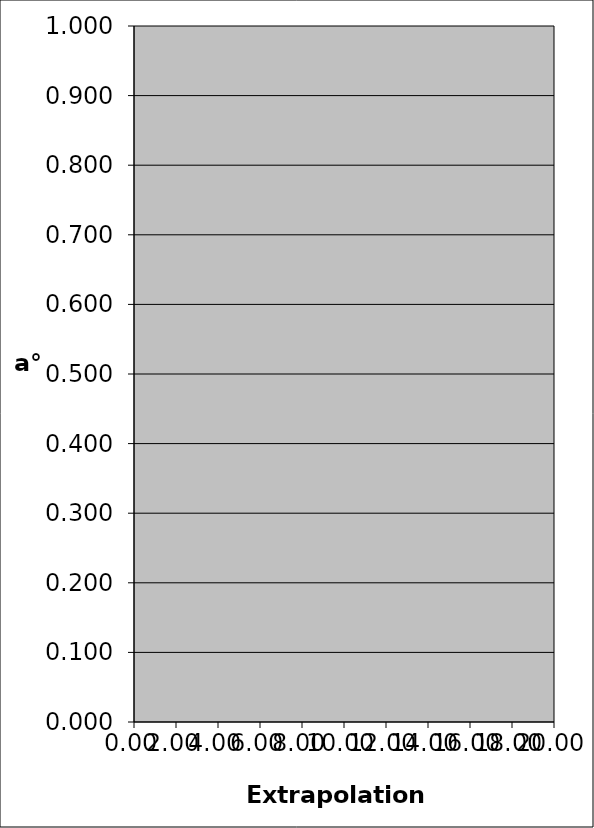
| Category | Extrapolation Function |
|---|---|
| 0.0 | 0 |
| 0.0 | 0 |
| 0.0 | 0 |
| 0.0 | 0 |
| 0.0 | 0 |
| 0.0 | 0 |
| 0.0 | 0 |
| 0.0 | 0 |
| 0.0 | 0 |
| 0.0 | 0 |
| 0.0 | 0 |
| 0.0 | 0 |
| 0.0 | 0 |
| 0.0 | 0 |
| 0.0 | 0 |
| 0.0 | 0 |
| 0.0 | 0 |
| 0.0 | 0 |
| 0.0 | 0 |